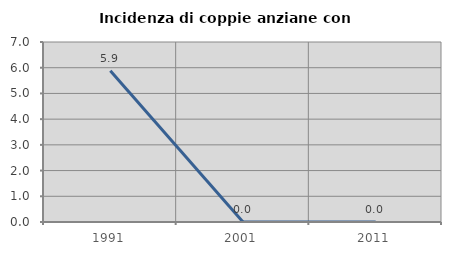
| Category | Incidenza di coppie anziane con figli |
|---|---|
| 1991.0 | 5.882 |
| 2001.0 | 0 |
| 2011.0 | 0 |